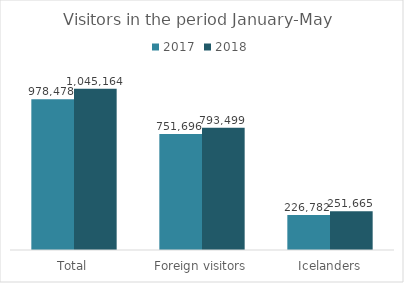
| Category | 2017 | 2018 |
|---|---|---|
| Total | 978478 | 1045164 |
| Foreign visitors | 751696 | 793499 |
| Icelanders | 226782 | 251665 |